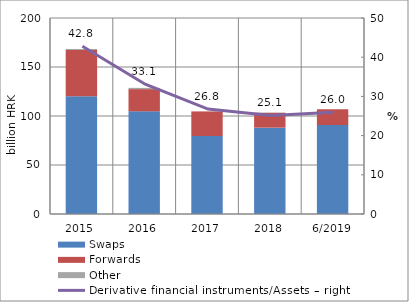
| Category | Swaps | Forwards  | Other |
|---|---|---|---|
| 2015 | 120.194 | 47.14 | 0.941 |
| 2016 | 104.771 | 22.663 | 1.263 |
| 2017 | 79.619 | 25.065 | 0.025 |
| 2018 | 88.09 | 15.156 | 0.324 |
| 6/2019 | 90.909 | 15.902 | 0.117 |